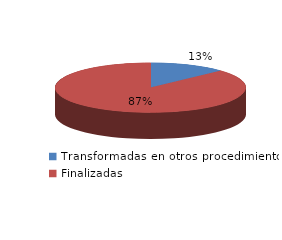
| Category | Series 0 |
|---|---|
| Transformadas en otros procedimientos | 8993 |
| Finalizadas | 60342 |